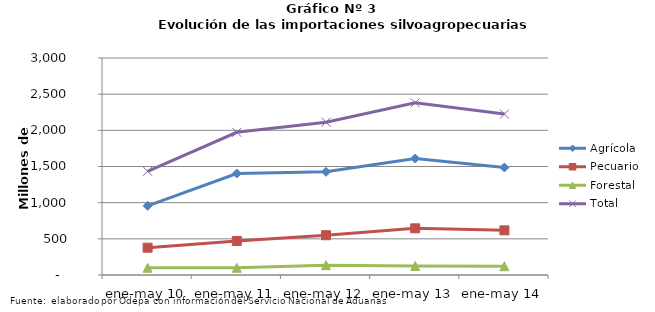
| Category | Agrícola | Pecuario | Forestal | Total |
|---|---|---|---|---|
| ene-may 10 | 956543 | 377407 | 100217 | 1434167 |
| ene-may 11 | 1403068 | 470323 | 99473 | 1972864 |
| ene-may 12 | 1426586 | 549865 | 136433 | 2112884 |
| ene-may 13 | 1610452 | 645048 | 125523 | 2381023 |
| ene-may 14 | 1486372 | 616966 | 121594 | 2224932 |